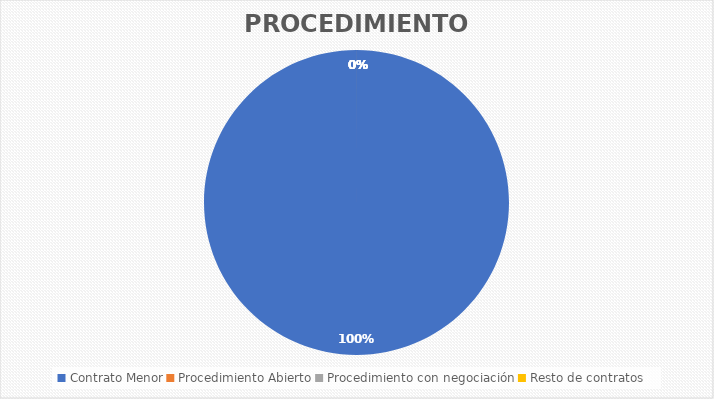
| Category | IVA incluido |
|---|---|
| Contrato Menor | 432.333 |
| Procedimiento Abierto | 0 |
| Procedimiento con negociación | 0 |
| Resto de contratos | 0 |